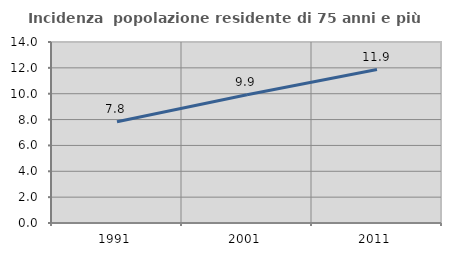
| Category | Incidenza  popolazione residente di 75 anni e più |
|---|---|
| 1991.0 | 7.834 |
| 2001.0 | 9.913 |
| 2011.0 | 11.872 |